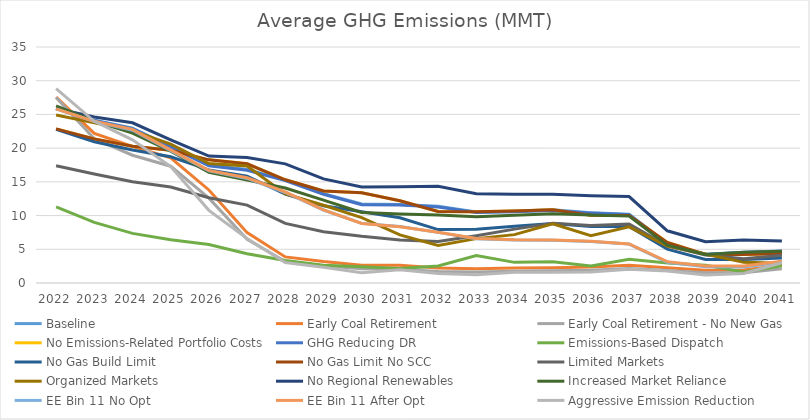
| Category | Baseline  | Early Coal Retirement | Early Coal Retirement - No New Gas | No Emissions-Related Portfolio Costs | GHG Reducing DR | Emissions-Based Dispatch | No Gas Build Limit | No Gas Limit No SCC | Limited Markets | Organized Markets | No Regional Renewables | Increased Market Reliance | EE Bin 11 No Opt | EE Bin 11 After Opt | Aggressive Emission Reduction |
|---|---|---|---|---|---|---|---|---|---|---|---|---|---|---|---|
| 2022.0 | 25.866 | 27.557 | 27.51 | 22.852 | 25.86 | 11.301 | 22.805 | 22.852 | 17.396 | 24.906 | 25.866 | 26.255 | 25.832 | 25.832 | 28.842 |
| 2023.0 | 24.132 | 22.194 | 21.382 | 21.374 | 24.088 | 8.985 | 20.944 | 21.374 | 16.155 | 23.749 | 24.619 | 24.004 | 23.951 | 23.975 | 23.983 |
| 2024.0 | 22.965 | 20.26 | 18.951 | 20.297 | 22.904 | 7.355 | 19.724 | 20.297 | 15.011 | 22.601 | 23.756 | 22.219 | 22.654 | 22.793 | 21.225 |
| 2025.0 | 20.221 | 18.551 | 17.324 | 19.687 | 20.147 | 6.401 | 18.724 | 19.687 | 14.241 | 20.604 | 21.223 | 19.542 | 19.641 | 19.747 | 17.267 |
| 2026.0 | 17.47 | 13.797 | 12.583 | 18.263 | 17.387 | 5.701 | 16.778 | 18.263 | 12.639 | 17.72 | 18.825 | 16.42 | 16.622 | 16.698 | 10.773 |
| 2027.0 | 16.821 | 7.47 | 6.486 | 17.677 | 16.72 | 4.345 | 15.843 | 17.677 | 11.553 | 17.346 | 18.603 | 15.26 | 15.508 | 15.602 | 6.59 |
| 2028.0 | 15.304 | 3.871 | 3.171 | 15.309 | 15.191 | 3.326 | 13.17 | 15.309 | 8.848 | 13.219 | 17.666 | 14.087 | 13.425 | 13.507 | 3.034 |
| 2029.0 | 13.24 | 3.177 | 2.569 | 13.649 | 13.163 | 2.638 | 11.465 | 13.649 | 7.607 | 11.533 | 15.437 | 12.292 | 10.823 | 10.847 | 2.328 |
| 2030.0 | 11.714 | 2.65 | 2.106 | 13.372 | 11.613 | 2.424 | 10.577 | 13.372 | 6.925 | 9.693 | 14.25 | 10.449 | 8.84 | 8.82 | 1.529 |
| 2031.0 | 11.659 | 2.621 | 2.038 | 12.186 | 11.579 | 2.166 | 9.671 | 12.186 | 6.371 | 7.13 | 14.262 | 10.247 | 8.372 | 8.348 | 1.966 |
| 2032.0 | 11.365 | 2.232 | 1.713 | 10.604 | 11.273 | 2.523 | 7.922 | 10.604 | 6.148 | 5.573 | 14.351 | 10.099 | 7.508 | 7.523 | 1.422 |
| 2033.0 | 10.539 | 2.122 | 1.633 | 10.567 | 10.451 | 4.074 | 7.982 | 10.567 | 7.005 | 6.581 | 13.241 | 9.823 | 6.576 | 6.602 | 1.227 |
| 2034.0 | 10.647 | 2.231 | 1.745 | 10.671 | 10.556 | 3.062 | 8.399 | 10.671 | 7.989 | 7.172 | 13.155 | 10.064 | 6.368 | 6.407 | 1.577 |
| 2035.0 | 10.854 | 2.275 | 1.825 | 10.859 | 10.769 | 3.133 | 8.835 | 10.859 | 8.856 | 8.791 | 13.145 | 10.287 | 6.326 | 6.363 | 1.584 |
| 2036.0 | 10.431 | 2.388 | 1.897 | 10.033 | 10.363 | 2.523 | 8.366 | 10.033 | 8.542 | 7.01 | 12.94 | 10.094 | 6.158 | 6.197 | 1.644 |
| 2037.0 | 10.193 | 2.631 | 2.147 | 10.012 | 10.132 | 3.508 | 8.382 | 10.012 | 8.749 | 8.324 | 12.824 | 9.919 | 5.776 | 5.801 | 2.023 |
| 2038.0 | 5.83 | 2.257 | 1.86 | 6.015 | 5.778 | 2.983 | 5.026 | 6.015 | 5.526 | 5.468 | 7.739 | 5.605 | 3.062 | 3.167 | 1.775 |
| 2039.0 | 4.27 | 1.878 | 1.518 | 4.24 | 4.226 | 2.645 | 3.48 | 4.24 | 4.157 | 4.294 | 6.109 | 4.218 | 2.427 | 2.538 | 1.172 |
| 2040.0 | 4.572 | 1.941 | 1.513 | 4.241 | 4.52 | 1.621 | 3.482 | 4.241 | 3.582 | 3.059 | 6.388 | 4.567 | 2.369 | 2.51 | 1.423 |
| 2041.0 | 4.748 | 2.636 | 2.097 | 4.361 | 4.722 | 2.561 | 3.717 | 4.361 | 4.118 | 2.914 | 6.243 | 4.715 | 3.119 | 3.22 | 3.011 |